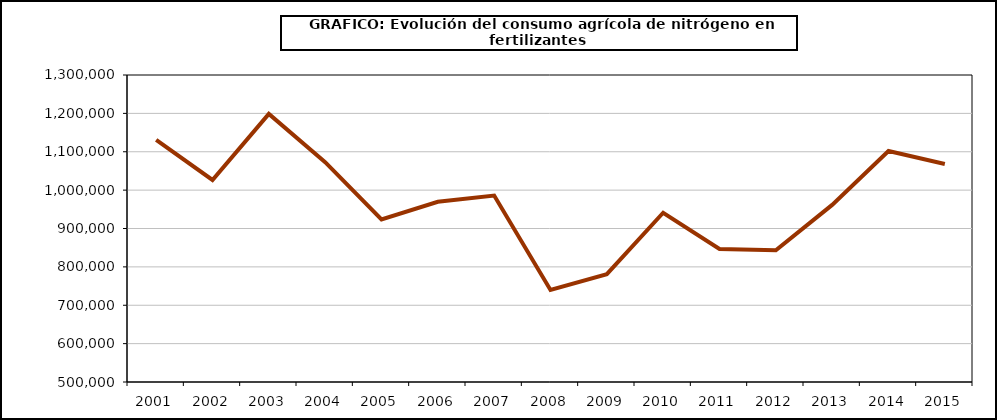
| Category | fertilizantes |
|---|---|
| 2001.0 | 1131006 |
| 2002.0 | 1026546 |
| 2003.0 | 1198606 |
| 2004.0 | 1072949 |
| 2005.0 | 923764 |
| 2006.0 | 969783 |
| 2007.0 | 985857 |
| 2008.0 | 739757 |
| 2009.0 | 781069 |
| 2010.0 | 940984 |
| 2011.0 | 846697 |
| 2012.0 | 843410 |
| 2013.0 | 961507 |
| 2014.0 | 1101895 |
| 2015.0 | 1068103 |